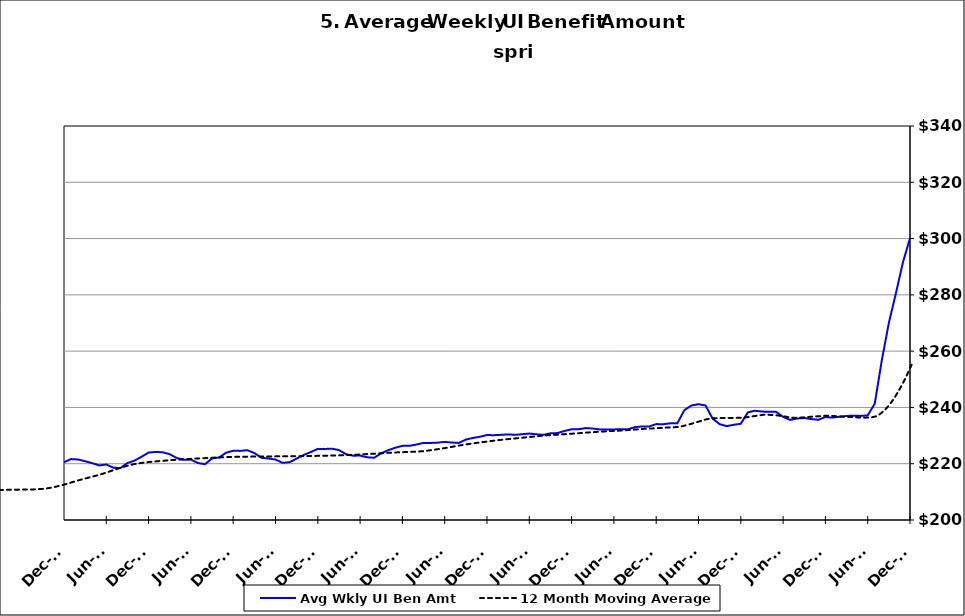
| Category | Avg Wkly UI Ben Amt |
|---|---|
| 1995-01-31 | 152.517 |
| 1995-02-28 | 151.164 |
| 1995-03-31 | 148.4 |
| 1995-04-30 | 146.034 |
| 1995-05-31 | 146.738 |
| 1995-06-30 | 147.885 |
| 1995-07-31 | 145.798 |
| 1995-08-31 | 144.052 |
| 1995-09-30 | 147.334 |
| 1995-10-31 | 151.535 |
| 1995-11-30 | 152.903 |
| 1995-12-31 | 153.258 |
| 1996-01-15 | 153.468 |
| 1996-02-15 | 153.032 |
| 1996-03-15 | 155.453 |
| 1996-04-15 | 148.614 |
| 1996-05-15 | 148.648 |
| 1996-06-15 | 150.145 |
| 1996-07-15 | 147.052 |
| 1996-08-15 | 146.042 |
| 1996-09-15 | 149.978 |
| 1996-10-15 | 151.319 |
| 1996-11-15 | 153.295 |
| 1996-12-15 | 155.775 |
| 1997-01-15 | 154.813 |
| 1997-02-15 | 151.102 |
| 1997-03-15 | 149.222 |
| 1997-04-15 | 145.178 |
| 1997-05-31 | 145.194 |
| 1997-06-30 | 146.718 |
| 1997-07-31 | 142.224 |
| 1997-08-31 | 142.382 |
| 1997-09-30 | 143.123 |
| 1997-10-31 | 146.797 |
| 1997-11-30 | 148.163 |
| 1997-12-31 | 147.967 |
| 1998-01-31 | 147.87 |
| 1998-02-28 | 147.591 |
| 1998-03-31 | 147.262 |
| 1998-04-30 | 144.746 |
| 1998-05-31 | 146.093 |
| 1998-06-30 | 147.355 |
| 1998-07-31 | 146.079 |
| 1998-08-31 | 147.387 |
| 1998-09-30 | 147.529 |
| 1998-10-31 | 152.825 |
| 1998-11-30 | 156.171 |
| 1998-12-31 | 156.424 |
| 1999-01-31 | 157.388 |
| 1999-02-28 | 157.868 |
| 1999-03-31 | 157.505 |
| 1999-04-30 | 153.987 |
| 1999-05-31 | 153.665 |
| 1999-06-30 | 153.746 |
| 1999-07-31 | 154.09 |
| 1999-08-31 | 156.162 |
| 1999-09-30 | 157.136 |
| 1999-10-31 | 162.476 |
| 1999-11-30 | 163.291 |
| 1999-12-31 | 165.621 |
| 2000-01-31 | 166.425 |
| 2000-02-29 | 165.378 |
| 2000-03-31 | 163.05 |
| 2000-04-30 | 161.908 |
| 2000-05-31 | 160.484 |
| 2000-06-30 | 160.865 |
| 2000-07-31 | 161.011 |
| 2000-08-31 | 158.845 |
| 2000-09-30 | 161.127 |
| 2000-10-31 | 163.997 |
| 2000-11-30 | 164.759 |
| 2000-12-31 | 166.66 |
| 2001-01-31 | 168.164 |
| 2001-02-28 | 169.339 |
| 2001-03-31 | 169.617 |
| 2001-04-30 | 170.349 |
| 2001-05-31 | 168.417 |
| 2001-06-30 | 169.418 |
| 2001-07-31 | 169.733 |
| 2001-08-31 | 170.578 |
| 2001-09-30 | 174.36 |
| 2001-10-31 | 176.952 |
| 2001-11-30 | 178.489 |
| 2001-12-31 | 179.805 |
| 2002-01-31 | 179.529 |
| 2002-02-28 | 179.269 |
| 2002-03-31 | 178.588 |
| 2002-04-30 | 177.594 |
| 2002-05-31 | 175.021 |
| 2002-06-30 | 175.298 |
| 2002-07-31 | 173.853 |
| 2002-08-31 | 172.776 |
| 2002-09-30 | 174.657 |
| 2002-10-31 | 175.648 |
| 2002-11-30 | 176.299 |
| 2002-12-31 | 177.239 |
| 2003-01-31 | 176.943 |
| 2003-02-28 | 176.988 |
| 2003-03-31 | 175.698 |
| 2003-04-30 | 172.857 |
| 2003-05-31 | 171.934 |
| 2003-06-30 | 171.956 |
| 2003-07-31 | 170.949 |
| 2003-08-31 | 171.311 |
| 2003-09-30 | 171.909 |
| 2003-10-31 | 172.692 |
| 2003-11-30 | 173.689 |
| 2003-12-31 | 174.176 |
| 2004-01-31 | 173.867 |
| 2004-02-29 | 173.648 |
| 2004-03-31 | 172.152 |
| 2004-04-30 | 170.705 |
| 2004-05-31 | 170.684 |
| 2004-06-30 | 170.635 |
| 2004-07-31 | 171.229 |
| 2004-08-31 | 175.375 |
| 2004-09-30 | 182.737 |
| 2004-10-31 | 187.554 |
| 2004-11-30 | 191.316 |
| 2004-12-31 | 194.602 |
| 2005-01-31 | 196.38 |
| 2005-02-28 | 196.569 |
| 2005-03-31 | 195.523 |
| 2005-04-30 | 193.655 |
| 2005-05-31 | 193.953 |
| 2005-06-30 | 192.728 |
| 2005-07-31 | 192.211 |
| 2005-08-31 | 191.133 |
| 2005-09-30 | 194.339 |
| 2005-10-31 | 196.819 |
| 2005-11-30 | 198.473 |
| 2005-12-31 | 199.545 |
| 2006-01-31 | 199.965 |
| 2006-02-28 | 200.117 |
| 2006-03-31 | 198.335 |
| 2006-04-30 | 197.258 |
| 2006-05-31 | 195.225 |
| 2006-06-30 | 195.734 |
| 2006-07-31 | 194.92 |
| 2006-08-31 | 194.282 |
| 2006-09-30 | 196.801 |
| 2006-10-31 | 199.137 |
| 2006-11-30 | 201.183 |
| 2006-12-31 | 202.121 |
| 2007-01-31 | 202.615 |
| 2007-02-28 | 202.465 |
| 2007-03-31 | 201.75 |
| 2007-04-30 | 200.344 |
| 2007-05-31 | 198.851 |
| 2007-06-30 | 198.258 |
| 2007-07-30 | 197.654 |
| 2007-08-31 | 198.405 |
| 2007-09-30 | 200.563 |
| 2007-10-31 | 201.857 |
| 2007-11-15 | 203.345 |
| 2007-12-15 09:36:00 | 219.243 |
| 2008-01-14 19:12:00 | 219.658 |
| 2008-02-14 04:48:00 | 220.121 |
| 2008-03-15 14:24:00 | 219.456 |
| 2008-04-15 | 217.672 |
| 2008-05-15 09:36:00 | 216.637 |
| 2008-06-14 19:12:00 | 216.035 |
| 2008-07-15 04:48:00 | 213.916 |
| 2008-08-14 14:24:00 | 214.008 |
| 2008-09-14 | 216.475 |
| 2008-10-14 09:36:00 | 217.836 |
| 2008-11-13 19:12:00 | 219.819 |
| 2008-12-14 04:48:00 | 221.529 |
| 2009-01-13 14:24:00 | 222.143 |
| 2009-02-13 | 222.091 |
| 2009-03-15 09:36:00 | 222.273 |
| 2009-04-14 19:12:00 | 222.011 |
| 2009-05-15 04:48:00 | 221.558 |
| 2009-06-14 14:24:00 | 220.761 |
| 2009-07-15 | 219.225 |
| 2009-08-14 09:36:00 | 218.364 |
| 2009-09-13 19:12:00 | 218.814 |
| 2009-10-14 04:48:00 | 218.744 |
| 2009-11-13 14:24:00 | 218.719 |
| 2009-12-14 | 218.779 |
| 2010-01-13 09:36:00 | 217.988 |
| 2010-02-12 19:12:00 | 217.521 |
| 2010-03-15 04:48:00 | 216.93 |
| 2010-04-14 14:24:00 | 215.638 |
| 2010-05-15 | 213.953 |
| 2010-06-14 09:36:00 | 213.326 |
| 2010-07-14 19:12:00 | 211.48 |
| 2010-08-14 04:48:00 | 210.615 |
| 2010-09-13 14:24:00 | 211.554 |
| 2010-10-14 | 211.956 |
| 2010-11-13 09:36:00 | 212.619 |
| 2010-12-13 19:12:00 | 212.979 |
| 2011-01-13 04:48:00 | 212.778 |
| 2011-02-12 14:24:00 | 212.812 |
| 2011-03-15 | 212.631 |
| 2011-04-14 09:36:00 | 211.659 |
| 2011-05-14 19:12:00 | 210.522 |
| 2011-06-14 04:48:00 | 209.652 |
| 2011-07-14 14:24:00 | 208.005 |
| 2011-08-14 | 207.451 |
| 2011-09-13 09:36:00 | 209.173 |
| 2011-10-13 19:12:00 | 209.736 |
| 2011-11-13 04:48:00 | 211.422 |
| 2011-12-13 14:24:00 | 212.679 |
| 2012-01-13 | 212.502 |
| 2012-02-12 09:36:00 | 212.715 |
| 2012-03-13 19:12:00 | 212.846 |
| 2012-04-13 04:48:00 | 212.323 |
| 2012-05-13 14:24:00 | 210.934 |
| 2012-06-13 | 210.073 |
| 2012-07-13 09:36:00 | 208.192 |
| 2012-08-12 19:12:00 | 208.902 |
| 2012-09-12 04:48:00 | 211.616 |
| 2012-10-12 14:24:00 | 214.814 |
| 2012-11-12 | 218.296 |
| 2012-12-12 09:36:00 | 220.532 |
| 2013-01-11 19:12:00 | 221.653 |
| 2013-02-11 04:48:00 | 221.49 |
| 2013-03-13 14:24:00 | 220.877 |
| 2013-04-13 | 220.198 |
| 2013-05-13 09:36:00 | 219.395 |
| 2013-06-12 19:12:00 | 219.716 |
| 2013-07-13 04:48:00 | 218.588 |
| 2013-08-12 14:24:00 | 218.444 |
| 2013-09-12 | 220.248 |
| 2013-10-12 09:36:00 | 221.094 |
| 2013-11-11 19:12:00 | 222.471 |
| 2013-12-12 04:48:00 | 223.964 |
| 2014-01-11 14:24:00 | 224.183 |
| 2014-02-11 | 224.065 |
| 2014-03-13 09:36:00 | 223.376 |
| 2014-04-12 19:12:00 | 222.017 |
| 2014-05-13 04:48:00 | 221.409 |
| 2014-06-12 14:24:00 | 221.458 |
| 2014-07-13 | 220.256 |
| 2014-08-12 09:36:00 | 219.823 |
| 2014-09-11 19:12:00 | 221.87 |
| 2014-10-12 04:48:00 | 222.223 |
| 2014-11-11 14:24:00 | 223.919 |
| 2014-12-12 | 224.606 |
| 2015-01-11 09:36:00 | 224.554 |
| 2015-02-10 19:12:00 | 224.808 |
| 2015-03-13 04:48:00 | 223.795 |
| 2015-04-12 14:24:00 | 222.11 |
| 2015-05-13 | 221.845 |
| 2015-06-12 09:36:00 | 221.492 |
| 2015-07-12 19:12:00 | 220.308 |
| 2015-08-12 04:48:00 | 220.534 |
| 2015-09-11 14:24:00 | 221.819 |
| 2015-10-12 | 223.117 |
| 2015-11-11 09:36:00 | 224.146 |
| 2015-12-11 19:12:00 | 225.264 |
| 2016-01-11 04:48:00 | 225.247 |
| 2016-02-10 14:24:00 | 225.331 |
| 2016-03-12 | 224.849 |
| 2016-04-11 09:36:00 | 223.376 |
| 2016-05-11 19:12:00 | 222.856 |
| 2016-06-11 04:48:00 | 222.895 |
| 2016-07-11 14:24:00 | 222.285 |
| 2016-08-11 | 222.119 |
| 2016-09-10 09:36:00 | 223.72 |
| 2016-10-10 19:12:00 | 224.805 |
| 2016-11-10 04:48:00 | 225.687 |
| 2016-12-10 14:24:00 | 226.349 |
| 2017-01-10 | 226.348 |
| 2017-02-09 09:36:00 | 226.816 |
| 2017-03-11 19:12:00 | 227.395 |
| 2017-04-11 04:48:00 | 227.37 |
| 2017-05-11 14:24:00 | 227.492 |
| 2017-06-11 | 227.755 |
| 2017-07-11 09:36:00 | 227.522 |
| 2017-08-10 19:12:00 | 227.382 |
| 2017-09-10 04:48:00 | 228.581 |
| 2017-10-10 14:24:00 | 229.154 |
| 2017-11-10 | 229.58 |
| 2017-12-10 09:36:00 | 230.186 |
| 2018-01-09 19:12:00 | 230.136 |
| 2018-02-09 04:48:00 | 230.265 |
| 2018-03-11 14:24:00 | 230.427 |
| 2018-04-11 | 230.25 |
| 2018-05-11 09:36:00 | 230.487 |
| 2018-06-10 19:12:00 | 230.714 |
| 2018-07-11 04:48:00 | 230.457 |
| 2018-08-10 14:24:00 | 230.244 |
| 2018-09-10 | 230.802 |
| 2018-10-10 09:36:00 | 230.887 |
| 2018-11-09 19:12:00 | 231.636 |
| 2018-12-10 04:48:00 | 232.24 |
| 2019-01-09 14:24:00 | 232.268 |
| 2019-02-09 | 232.662 |
| 2019-03-11 09:36:00 | 232.508 |
| 2019-04-10 19:12:00 | 232.152 |
| 2019-05-11 04:48:00 | 232.145 |
| 2019-06-10 14:24:00 | 232.186 |
| 2019-07-11 | 232.27 |
| 2019-08-10 09:36:00 | 232.238 |
| 2019-09-09 19:12:00 | 232.999 |
| 2019-10-10 04:48:00 | 233.25 |
| 2019-11-09 14:24:00 | 233.231 |
| 2019-12-10 | 234.074 |
| 2020-01-09 09:36:00 | 234.041 |
| 2020-02-08 19:12:00 | 234.352 |
| 2020-03-10 04:48:00 | 234.377 |
| 2020-04-09 14:24:00 | 239.041 |
| 2020-05-10 | 240.685 |
| 2020-06-09 09:36:00 | 241.153 |
| 2020-07-09 19:12:00 | 240.685 |
| 2020-08-09 04:48:00 | 236.032 |
| 2020-09-08 14:24:00 | 234.062 |
| 2020-10-09 | 233.35 |
| 2020-11-08 09:36:00 | 233.83 |
| 2020-12-08 19:12:00 | 234.208 |
| 2021-01-08 04:48:00 | 238.23 |
| 2021-02-07 14:24:00 | 238.83 |
| 2021-03-10 | 238.528 |
| 2021-04-09 09:36:00 | 238.456 |
| 2021-05-09 19:12:00 | 238.445 |
| 2021-06-09 04:48:00 | 236.633 |
| 2021-07-09 14:24:00 | 235.568 |
| 2021-08-09 | 236.063 |
| 2021-09-08 09:36:00 | 236.227 |
| 2021-10-08 19:12:00 | 235.874 |
| 2021-11-08 04:48:00 | 235.609 |
| 2021-12-08 14:24:00 | 236.585 |
| 2022-01-08 | 236.385 |
| 2022-02-07 09:36:00 | 236.701 |
| 2022-03-09 19:12:00 | 236.956 |
| 2022-04-09 04:48:00 | 237.085 |
| 2022-05-09 14:24:00 | 236.985 |
| 2022-06-09 | 237.182 |
| 2022-07-09 09:36:00 | 241.326 |
| 2022-08-08 19:12:00 | 256.732 |
| 2022-09-08 04:48:00 | 270.047 |
| 2022-10-08 14:24:00 | 280.558 |
| 2022-11-08 | 291.58 |
| 2022-12-08 09:36:00 | 300.147 |